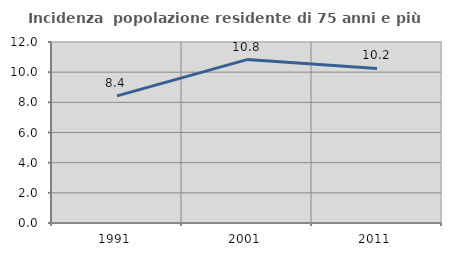
| Category | Incidenza  popolazione residente di 75 anni e più |
|---|---|
| 1991.0 | 8.43 |
| 2001.0 | 10.835 |
| 2011.0 | 10.248 |